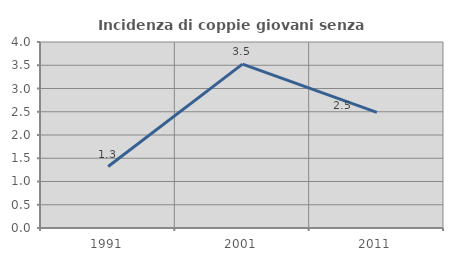
| Category | Incidenza di coppie giovani senza figli |
|---|---|
| 1991.0 | 1.322 |
| 2001.0 | 3.524 |
| 2011.0 | 2.488 |